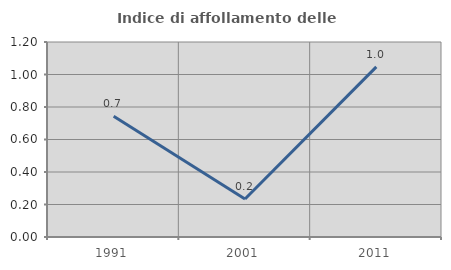
| Category | Indice di affollamento delle abitazioni  |
|---|---|
| 1991.0 | 0.743 |
| 2001.0 | 0.234 |
| 2011.0 | 1.047 |